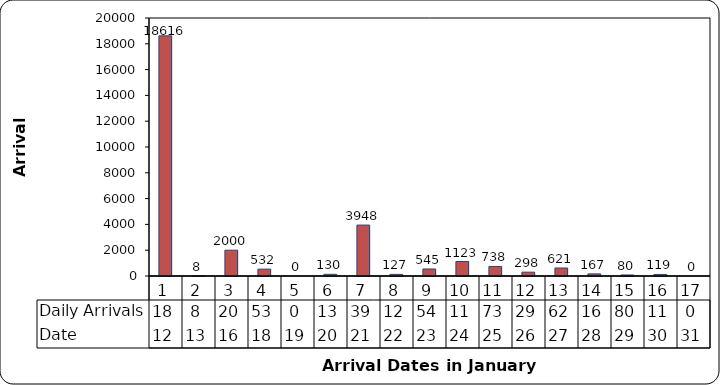
| Category | Daily Arrivals |
|---|---|
| 0 | 18616 |
| 1 | 8 |
| 2 | 2000 |
| 3 | 532 |
| 4 | 0 |
| 5 | 130 |
| 6 | 3948 |
| 7 | 127 |
| 8 | 545 |
| 9 | 1123 |
| 10 | 738 |
| 11 | 298 |
| 12 | 621 |
| 13 | 167 |
| 14 | 80 |
| 15 | 119 |
| 16 | 0 |